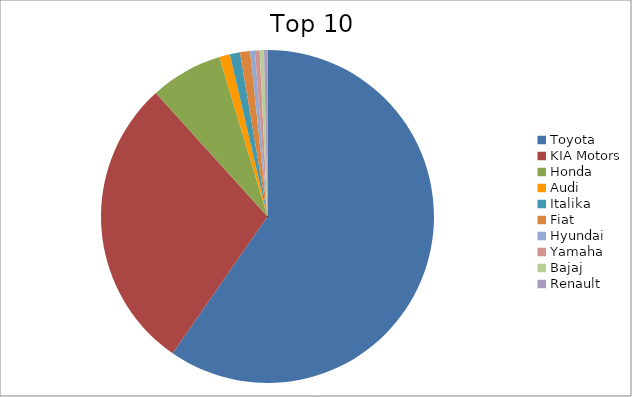
| Category | Series 0 |
|---|---|
| Toyota | 59.66 |
| KIA Motors | 28.66 |
| Honda | 7.03 |
| Audi | 1.04 |
| Italika | 0.98 |
| Fiat | 0.98 |
| Hyundai | 0.46 |
| Yamaha | 0.46 |
| Bajaj | 0.42 |
| Renault | 0.33 |